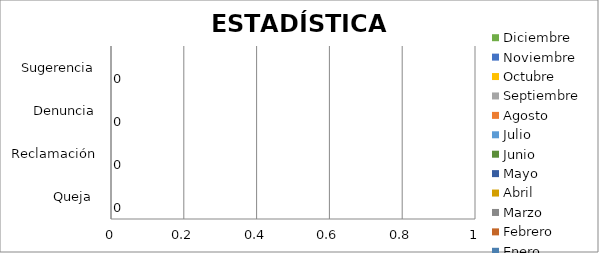
| Category | Enero | Febrero | Marzo | Abril | Mayo | Junio | Julio | Agosto | Septiembre | Octubre | Noviembre | Diciembre |
|---|---|---|---|---|---|---|---|---|---|---|---|---|
| Queja  | 0 | 0 | 0 |  |  |  |  |  |  |  |  |  |
| Reclamación | 0 | 0 | 0 |  |  |  |  |  |  |  |  |  |
| Denuncia | 0 | 0 | 0 |  |  |  |  |  |  |  |  |  |
| Sugerencia | 0 | 0 | 0 |  |  |  |  |  |  |  |  |  |